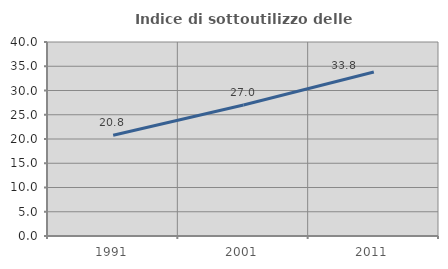
| Category | Indice di sottoutilizzo delle abitazioni  |
|---|---|
| 1991.0 | 20.784 |
| 2001.0 | 26.998 |
| 2011.0 | 33.803 |